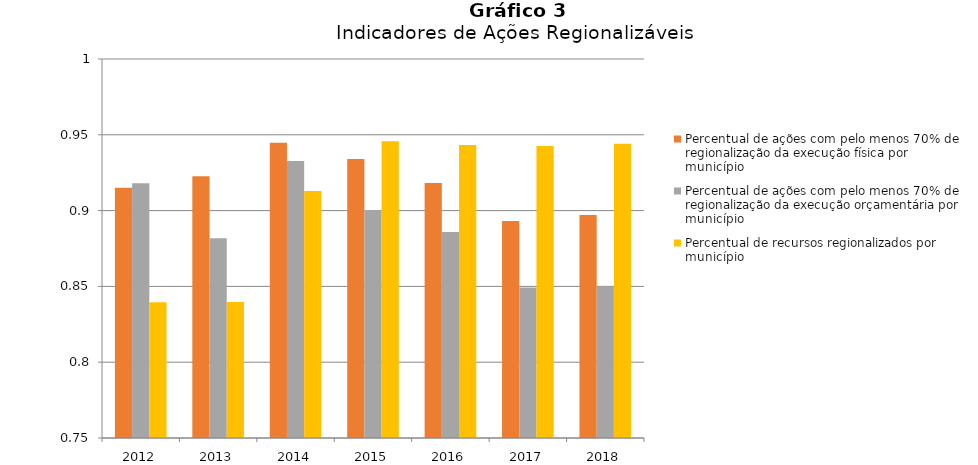
| Category | Percentual de ações com pelo menos 70% de regionalização da execução física por município | Percentual de ações com pelo menos 70% de regionalização da execução orçamentária por município | Percentual de recursos regionalizados por município |
|---|---|---|---|
| 2012.0 | 0.915 | 0.918 | 0.84 |
| 2013.0 | 0.923 | 0.882 | 0.84 |
| 2014.0 | 0.945 | 0.933 | 0.913 |
| 2015.0 | 0.934 | 0.9 | 0.946 |
| 2016.0 | 0.918 | 0.886 | 0.943 |
| 2017.0 | 0.893 | 0.849 | 0.943 |
| 2018.0 | 0.897 | 0.85 | 0.944 |